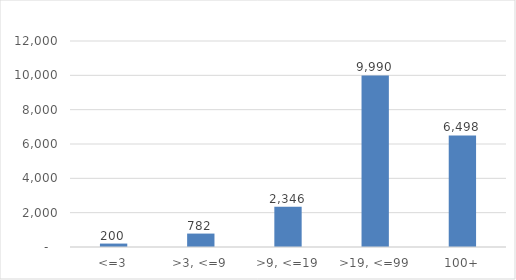
| Category |  Employees (000s)  |
|---|---|
| <=3 | 199.6 |
| >3, <=9 | 781.9 |
| >9, <=19 | 2346 |
| >19, <=99 | 9990.3 |
| 100+ | 6498 |